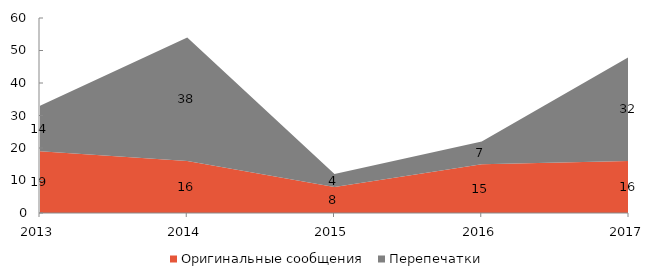
| Category | Оригинальные сообщения | Перепечатки |
|---|---|---|
| 2013 | 19 | 14 |
| 2014 | 16 | 38 |
| 2015 | 8 | 4 |
| 2016 | 15 | 7 |
| 2017 | 16 | 32 |